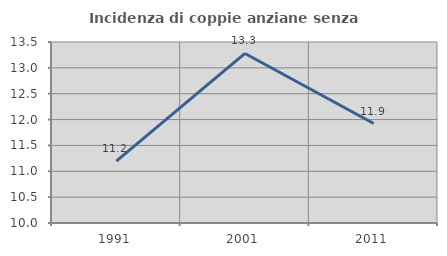
| Category | Incidenza di coppie anziane senza figli  |
|---|---|
| 1991.0 | 11.196 |
| 2001.0 | 13.279 |
| 2011.0 | 11.924 |